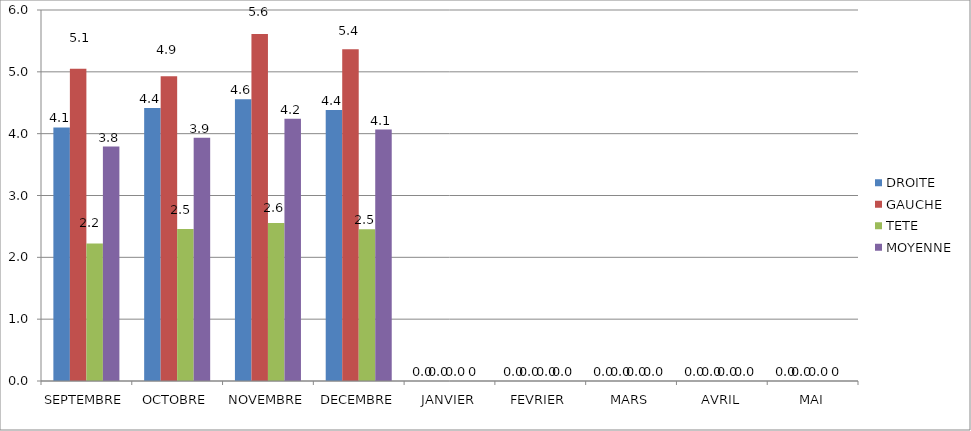
| Category | DROITE | GAUCHE | TETE | MOYENNE |
|---|---|---|---|---|
| SEPTEMBRE | 4.1 | 5.05 | 2.225 | 3.792 |
| OCTOBRE | 4.414 | 4.929 | 2.457 | 3.933 |
| NOVEMBRE | 4.556 | 5.611 | 2.556 | 4.241 |
| DECEMBRE | 4.382 | 5.364 | 2.455 | 4.067 |
| JANVIER | 0 | 0 | 0 | 0 |
| FEVRIER | 0 | 0 | 0 | 0 |
| MARS | 0 | 0 | 0 | 0 |
| AVRIL | 0 | 0 | 0 | 0 |
| MAI | 0 | 0 | 0 | 0 |